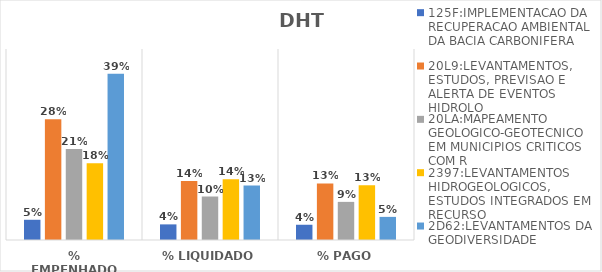
| Category | 125F:IMPLEMENTACAO DA RECUPERACAO AMBIENTAL DA BACIA CARBONIFERA | 20L9:LEVANTAMENTOS, ESTUDOS, PREVISAO E ALERTA DE EVENTOS HIDROLO | 20LA:MAPEAMENTO GEOLOGICO-GEOTECNICO EM MUNICIPIOS CRITICOS COM R | 2397:LEVANTAMENTOS HIDROGEOLOGICOS, ESTUDOS INTEGRADOS EM RECURSO | 2D62:LEVANTAMENTOS DA GEODIVERSIDADE |
|---|---|---|---|---|---|
| % EMPENHADO | 0.048 | 0.284 | 0.214 | 0.181 | 0.392 |
| % LIQUIDADO | 0.037 | 0.139 | 0.102 | 0.143 | 0.128 |
| % PAGO | 0.036 | 0.133 | 0.09 | 0.129 | 0.054 |